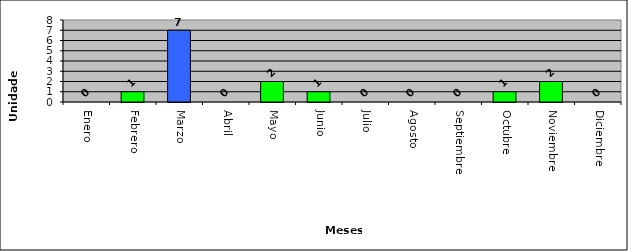
| Category | Dominicanos extraditados |
|---|---|
| Enero | 0 |
| Febrero | 1 |
| Marzo | 7 |
| Abril | 0 |
| Mayo | 2 |
| Junio | 1 |
| Julio | 0 |
| Agosto | 0 |
| Septiembre | 0 |
| Octubre | 1 |
| Noviembre | 2 |
| Diciembre | 0 |